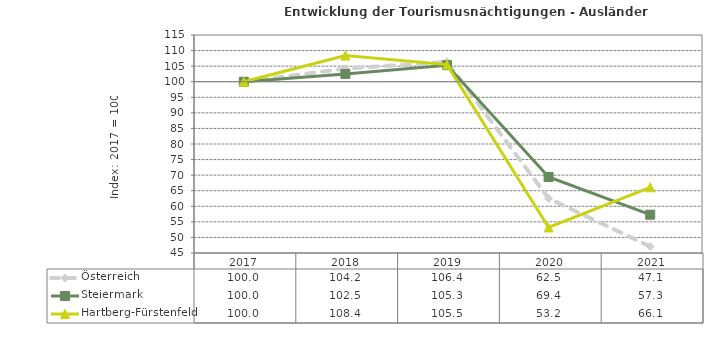
| Category | Österreich | Steiermark | Hartberg-Fürstenfeld |
|---|---|---|---|
| 2021.0 | 47.1 | 57.3 | 66.1 |
| 2020.0 | 62.5 | 69.4 | 53.2 |
| 2019.0 | 106.4 | 105.3 | 105.5 |
| 2018.0 | 104.2 | 102.5 | 108.4 |
| 2017.0 | 100 | 100 | 100 |